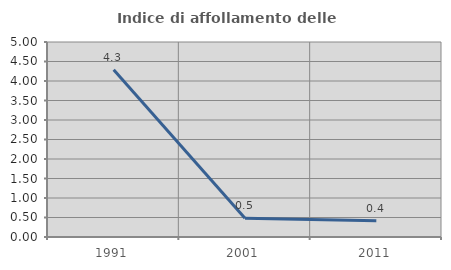
| Category | Indice di affollamento delle abitazioni  |
|---|---|
| 1991.0 | 4.29 |
| 2001.0 | 0.481 |
| 2011.0 | 0.418 |